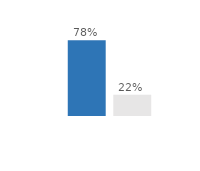
| Category | Importants ou assez importants | Peu importants ou pas de dégâts |
|---|---|---|
| 0 | 0.78 | 0.22 |